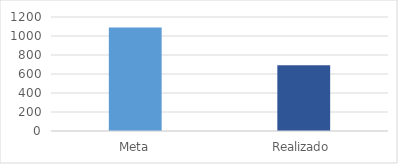
| Category | Series 0 |
|---|---|
| Meta | 1090 |
| Realizado | 691 |